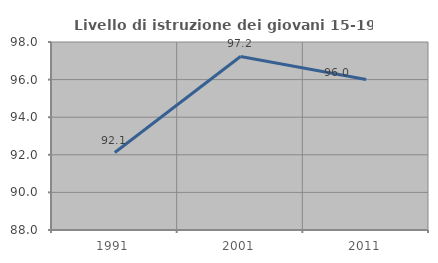
| Category | Livello di istruzione dei giovani 15-19 anni |
|---|---|
| 1991.0 | 92.121 |
| 2001.0 | 97.232 |
| 2011.0 | 96 |